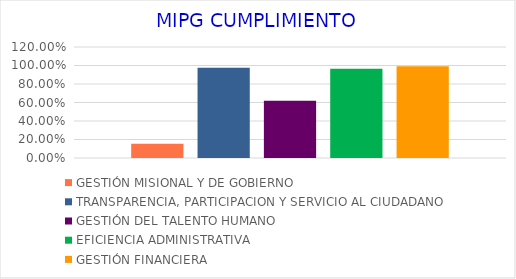
| Category | GESTIÓN MISIONAL Y DE GOBIERNO | TRANSPARENCIA, PARTICIPACION Y SERVICIO AL CIUDADANO | GESTIÓN DEL TALENTO HUMANO | EFICIENCIA ADMINISTRATIVA | GESTIÓN FINANCIERA |
|---|---|---|---|---|---|
| 0 | 0.154 | 0.977 | 0.619 | 0.965 | 0.992 |